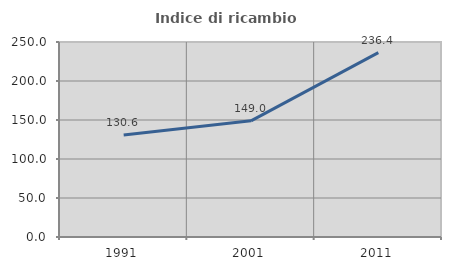
| Category | Indice di ricambio occupazionale  |
|---|---|
| 1991.0 | 130.625 |
| 2001.0 | 148.966 |
| 2011.0 | 236.449 |